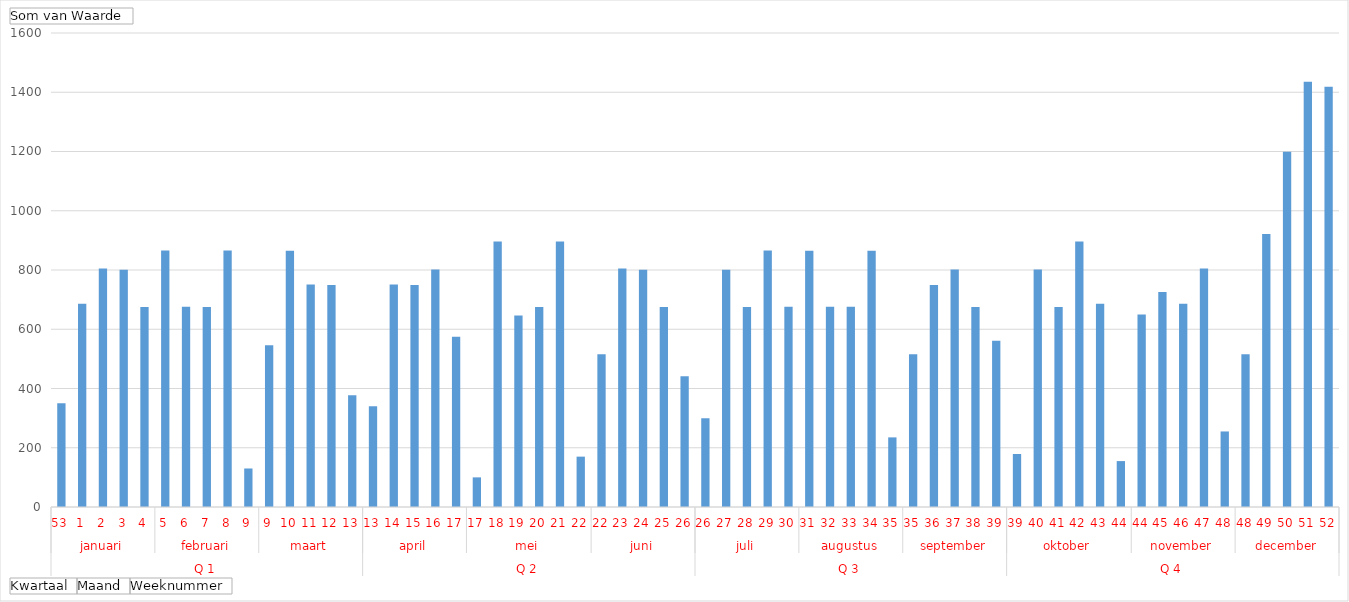
| Category | Totaal |
|---|---|
| 0 | 350 |
| 1 | 686 |
| 2 | 805 |
| 3 | 801 |
| 4 | 675 |
| 5 | 866 |
| 6 | 676 |
| 7 | 675 |
| 8 | 866 |
| 9 | 130 |
| 10 | 546 |
| 11 | 865 |
| 12 | 751 |
| 13 | 749 |
| 14 | 377 |
| 15 | 340 |
| 16 | 751 |
| 17 | 749 |
| 18 | 802 |
| 19 | 575 |
| 20 | 100 |
| 21 | 896 |
| 22 | 646 |
| 23 | 675 |
| 24 | 896 |
| 25 | 170 |
| 26 | 516 |
| 27 | 805 |
| 28 | 801 |
| 29 | 675 |
| 30 | 441 |
| 31 | 300 |
| 32 | 801 |
| 33 | 675 |
| 34 | 866 |
| 35 | 676 |
| 36 | 865 |
| 37 | 676 |
| 38 | 676 |
| 39 | 865 |
| 40 | 235 |
| 41 | 516 |
| 42 | 749 |
| 43 | 802 |
| 44 | 675 |
| 45 | 561 |
| 46 | 179 |
| 47 | 802 |
| 48 | 675 |
| 49 | 896 |
| 50 | 686 |
| 51 | 155 |
| 52 | 650 |
| 53 | 726 |
| 54 | 686 |
| 55 | 805 |
| 56 | 255 |
| 57 | 516 |
| 58 | 921.395 |
| 59 | 1198.925 |
| 60 | 1435.53 |
| 61 | 1418.773 |